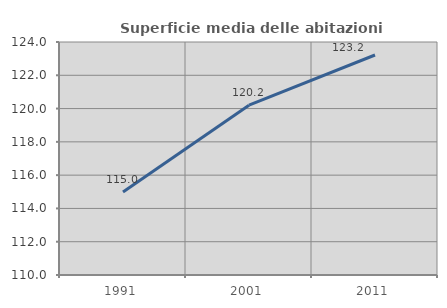
| Category | Superficie media delle abitazioni occupate |
|---|---|
| 1991.0 | 114.981 |
| 2001.0 | 120.204 |
| 2011.0 | 123.218 |